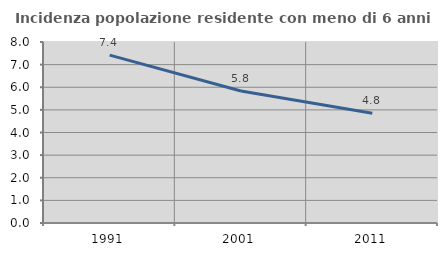
| Category | Incidenza popolazione residente con meno di 6 anni |
|---|---|
| 1991.0 | 7.418 |
| 2001.0 | 5.836 |
| 2011.0 | 4.847 |